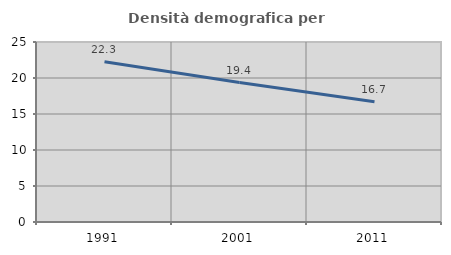
| Category | Densità demografica |
|---|---|
| 1991.0 | 22.263 |
| 2001.0 | 19.369 |
| 2011.0 | 16.69 |